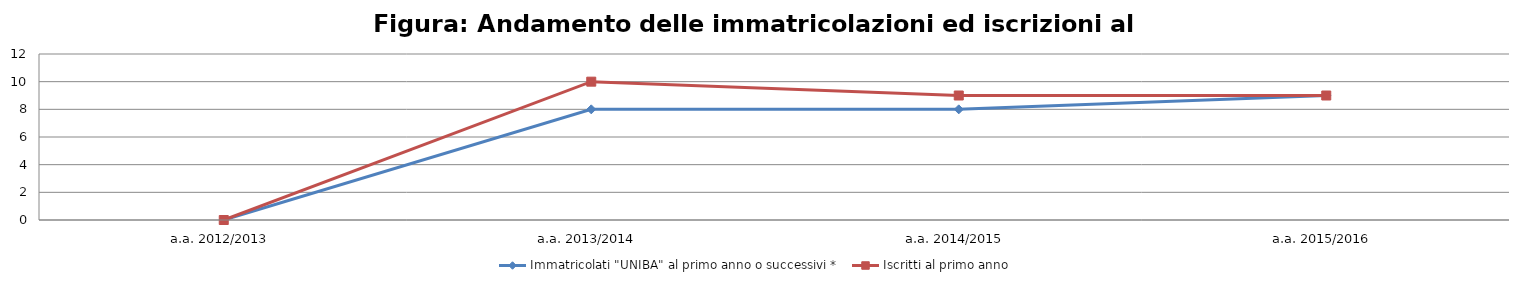
| Category | Immatricolati "UNIBA" al primo anno o successivi * | Iscritti al primo anno  |
|---|---|---|
| a.a. 2012/2013 | 0 | 0 |
| a.a. 2013/2014 | 8 | 10 |
| a.a. 2014/2015 | 8 | 9 |
| a.a. 2015/2016 | 9 | 9 |